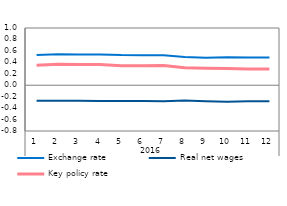
| Category | Exchange rate | Real net wages | Key policy rate |
|---|---|---|---|
| 0 | 0.528 | -0.271 | 0.349 |
| 1900-01-01 | 0.539 | -0.273 | 0.366 |
| 1900-01-02 | 0.538 | -0.272 | 0.36 |
| 1900-01-03 | 0.538 | -0.274 | 0.363 |
| 1900-01-04 | 0.526 | -0.274 | 0.34 |
| 1900-01-05 | 0.523 | -0.278 | 0.34 |
| 1900-01-06 | 0.522 | -0.282 | 0.344 |
| 1900-01-07 | 0.493 | -0.267 | 0.304 |
| 1900-01-08 | 0.48 | -0.279 | 0.294 |
| 1900-01-09 | 0.487 | -0.288 | 0.293 |
| 1900-01-10 | 0.483 | -0.28 | 0.285 |
| 1900-01-11 | 0.483 | -0.28 | 0.285 |